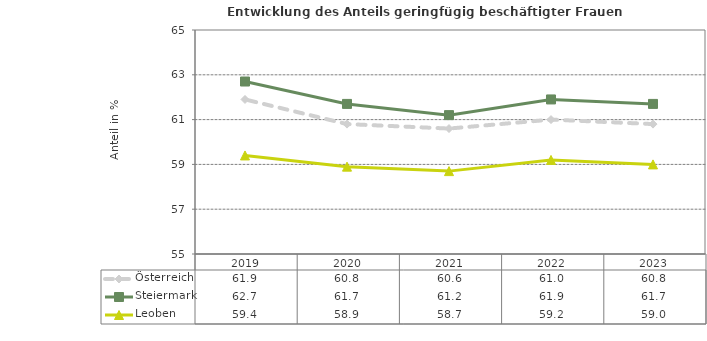
| Category | Österreich | Steiermark | Leoben |
|---|---|---|---|
| 2023.0 | 60.8 | 61.7 | 59 |
| 2022.0 | 61 | 61.9 | 59.2 |
| 2021.0 | 60.6 | 61.2 | 58.7 |
| 2020.0 | 60.8 | 61.7 | 58.9 |
| 2019.0 | 61.9 | 62.7 | 59.4 |